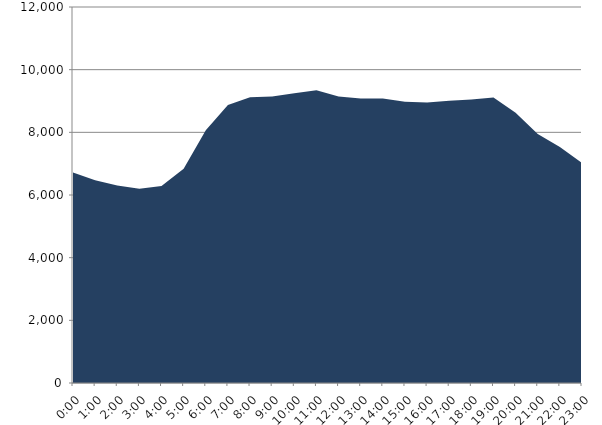
| Category | Series 0 | Series 1 |
|---|---|---|
| 2018-09-19 |  | 6721 |
| 2018-09-19 01:00:00 |  | 6469.13 |
| 2018-09-19 02:00:00 |  | 6303.45 |
| 2018-09-19 03:00:00 |  | 6196.84 |
| 2018-09-19 04:00:00 |  | 6290.02 |
| 2018-09-19 05:00:00 |  | 6836.88 |
| 2018-09-19 06:00:00 |  | 8066.51 |
| 2018-09-19 07:00:00 |  | 8868.65 |
| 2018-09-19 08:00:00 |  | 9117.3 |
| 2018-09-19 09:00:00 |  | 9144.65 |
| 2018-09-19 10:00:00 |  | 9248.67 |
| 2018-09-19 11:00:00 |  | 9346.57 |
| 2018-09-19 12:00:00 |  | 9140.38 |
| 2018-09-19 13:00:00 |  | 9079.18 |
| 2018-09-19 14:00:00 |  | 9081.21 |
| 2018-09-19 15:00:00 |  | 8977.67 |
| 2018-09-19 16:00:00 |  | 8949.7 |
| 2018-09-19 17:00:00 |  | 9004.54 |
| 2018-09-19 18:00:00 |  | 9048.65 |
| 2018-09-19 19:00:00 |  | 9115.03 |
| 2018-09-19 20:00:00 |  | 8623.12 |
| 2018-09-19 21:00:00 |  | 7946.18 |
| 2018-09-19 22:00:00 |  | 7532.02 |
| 2018-09-19 23:00:00 |  | 7021.38 |